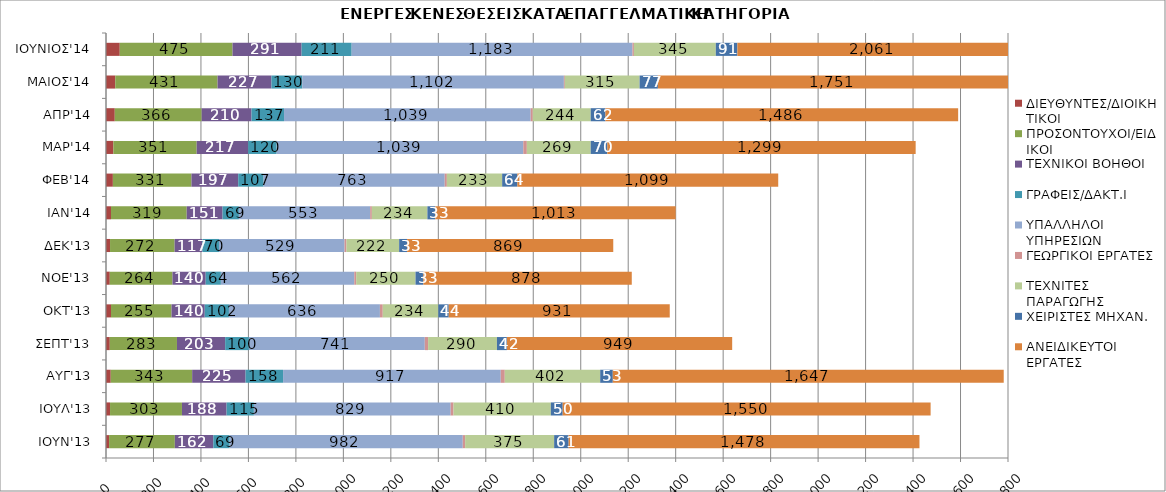
| Category | ΔΙΕΥΘΥΝΤΕΣ/ΔΙΟΙΚΗΤΙΚΟΙ | ΠΡΟΣΟΝΤΟΥΧΟΙ/ΕΙΔΙΚΟΙ | ΤΕΧΝΙΚΟΙ ΒΟΗΘΟΙ | ΓΡΑΦΕΙΣ/ΔΑΚΤ.Ι | ΥΠΑΛΛΗΛΟΙ ΥΠΗΡΕΣΙΩΝ | ΓΕΩΡΓΙΚΟΙ ΕΡΓΑΤΕΣ | ΤΕΧΝΙΤΕΣ ΠΑΡΑΓΩΓΗΣ | ΧΕΙΡΙΣΤΕΣ ΜΗΧΑΝ. | ΑΝΕΙΔΙΚΕΥΤΟΙ ΕΡΓΑΤΕΣ |
|---|---|---|---|---|---|---|---|---|---|
| ΙΟΥΝ'13 | 13 | 277 | 162 | 69 | 982 | 10 | 375 | 61 | 1478 |
| ΙΟΥΛ'13 | 17 | 303 | 188 | 115 | 829 | 12 | 410 | 50 | 1550 |
| ΑΥΓ'13 | 20 | 343 | 225 | 158 | 917 | 17 | 402 | 53 | 1647 |
| ΣΕΠΤ'13 | 16 | 283 | 203 | 100 | 741 | 14 | 290 | 42 | 949 |
| ΟΚΤ'13 | 21 | 255 | 140 | 102 | 636 | 12 | 234 | 44 | 931 |
| NOE'13 | 16 | 264 | 140 | 64 | 562 | 8 | 250 | 33 | 878 |
| ΔΕΚ'13 | 17 | 272 | 117 | 70 | 529 | 8 | 222 | 33 | 869 |
| IAN'14 | 21 | 319 | 151 | 69 | 553 | 7 | 234 | 33 | 1013 |
| ΦΕΒ'14 | 29 | 331 | 197 | 107 | 763 | 9 | 233 | 64 | 1099 |
| ΜΑΡ'14 | 31 | 351 | 217 | 120 | 1039 | 15 | 269 | 70 | 1299 |
| ΑΠΡ'14 | 37 | 366 | 210 | 137 | 1039 | 9 | 244 | 62 | 1486 |
| ΜΑΙΟΣ'14 | 39 | 431 | 227 | 130 | 1102 | 4 | 315 | 77 | 1751 |
| ΙΟΥΝΙΟΣ'14 | 58 | 475 | 291 | 211 | 1183 | 6 | 345 | 91 | 2061 |